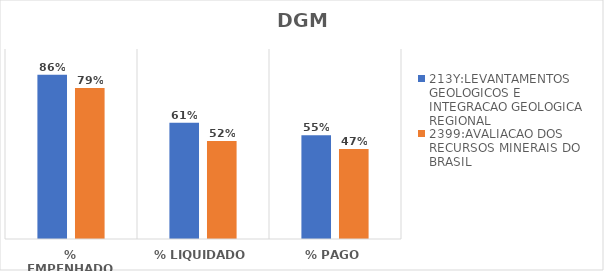
| Category | 213Y:LEVANTAMENTOS GEOLOGICOS E INTEGRACAO GEOLOGICA REGIONAL | 2399:AVALIACAO DOS RECURSOS MINERAIS DO BRASIL |
|---|---|---|
| % EMPENHADO | 0.864 | 0.794 |
| % LIQUIDADO | 0.612 | 0.516 |
| % PAGO | 0.546 | 0.474 |